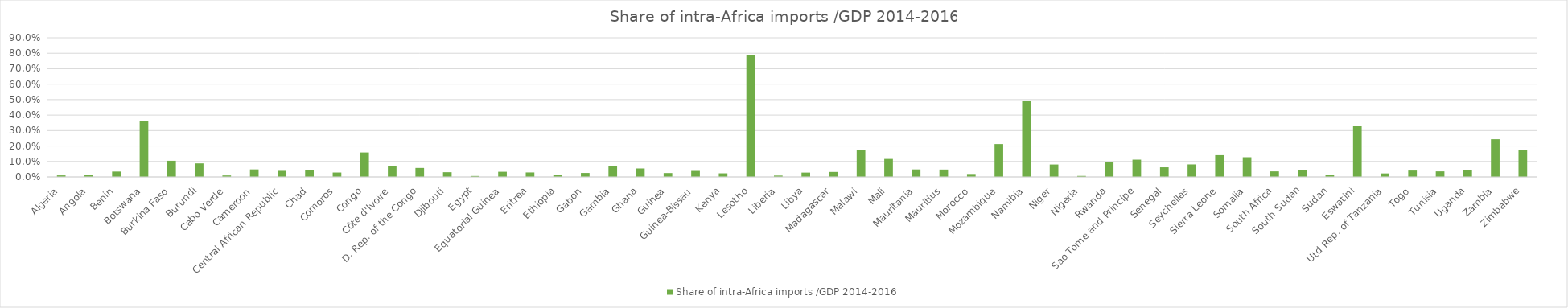
| Category | Share of intra-Africa imports /GDP 2014-2016 |
|---|---|
| Algeria | 0.01 |
| Angola | 0.014 |
| Benin | 0.035 |
| Botswana | 0.363 |
| Burkina Faso | 0.104 |
| Burundi | 0.087 |
| Cabo Verde | 0.009 |
| Cameroon | 0.049 |
| Central African Republic | 0.039 |
| Chad | 0.044 |
| Comoros | 0.028 |
| Congo | 0.158 |
| Côte d'Ivoire | 0.07 |
| D. Rep. of the Congo | 0.058 |
| Djibouti | 0.03 |
| Egypt | 0.006 |
| Equatorial Guinea | 0.033 |
| Eritrea | 0.029 |
| Ethiopia | 0.01 |
| Gabon | 0.026 |
| Gambia | 0.072 |
| Ghana | 0.055 |
| Guinea | 0.025 |
| Guinea-Bissau | 0.039 |
| Kenya | 0.023 |
| Lesotho | 0.787 |
| Liberia | 0.009 |
| Libya | 0.028 |
| Madagascar | 0.032 |
| Malawi | 0.174 |
| Mali | 0.116 |
| Mauritania | 0.048 |
| Mauritius | 0.048 |
| Morocco | 0.019 |
| Mozambique | 0.213 |
| Namibia | 0.49 |
| Niger | 0.08 |
| Nigeria | 0.006 |
| Rwanda | 0.098 |
| Sao Tome and Principe | 0.112 |
| Senegal | 0.062 |
| Seychelles | 0.081 |
| Sierra Leone | 0.141 |
| Somalia | 0.127 |
| South Africa | 0.036 |
| South Sudan | 0.043 |
| Sudan | 0.011 |
| Eswatini | 0.328 |
| Utd Rep. of Tanzania | 0.023 |
| Togo | 0.041 |
| Tunisia | 0.036 |
| Uganda | 0.045 |
| Zambia | 0.244 |
| Zimbabwe | 0.174 |